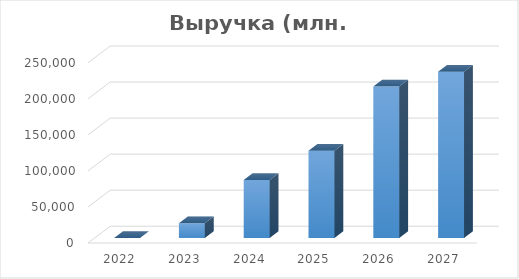
| Category | Выручка (млн. руб.) |
|---|---|
| 2022.0 | 0 |
| 2023.0 | 20456 |
| 2024.0 | 80364 |
| 2025.0 | 120998 |
| 2026.0 | 210223 |
| 2027.0 | 230457 |